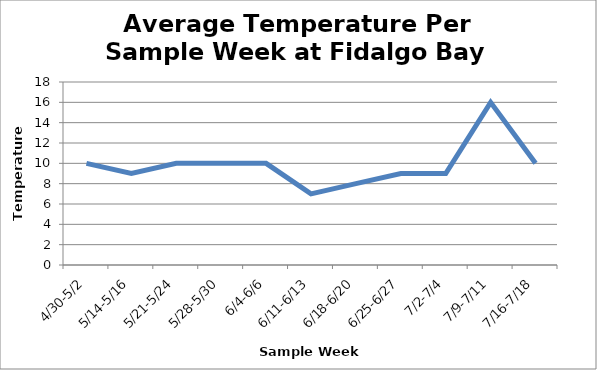
| Category | Fidalgo |
|---|---|
| 4/30-5/2 | 10 |
| 5/14-5/16 | 9 |
| 5/21-5/24 | 10 |
| 5/28-5/30 | 10 |
| 6/4-6/6 | 10 |
| 6/11-6/13 | 7 |
| 6/18-6/20 | 8 |
| 6/25-6/27 | 9 |
| 7/2-7/4 | 9 |
| 7/9-7/11 | 16 |
| 7/16-7/18 | 10 |